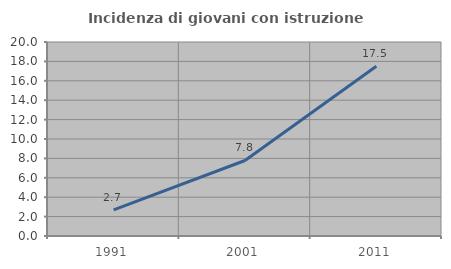
| Category | Incidenza di giovani con istruzione universitaria |
|---|---|
| 1991.0 | 2.703 |
| 2001.0 | 7.784 |
| 2011.0 | 17.5 |